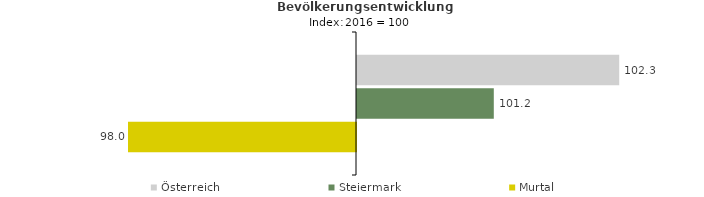
| Category | Österreich | Steiermark | Murtal |
|---|---|---|---|
| 2020.0 | 102.3 | 101.2 | 98 |